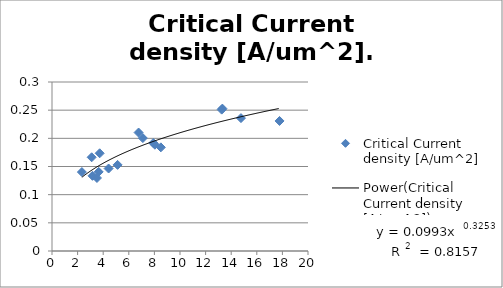
| Category | Critical Current density [A/um^2] |
|---|---|
| 3.1651999999999996 | 0.133 |
| 2.3352 | 0.14 |
| 3.6456 | 0.14 |
| 3.0997 | 0.166 |
| 3.5133 | 0.13 |
| 4.421500000000001 | 0.146 |
| 5.124 | 0.153 |
| 3.7249 | 0.173 |
| 8.0388 | 0.189 |
| 8.5039 | 0.184 |
| 7.097 | 0.2 |
| 6.7646 | 0.21 |
| 7.9112 | 0.192 |
| 14.761999999999999 | 0.236 |
| 17.776999999999997 | 0.231 |
| 13.2568 | 0.251 |
| 13.3108 | 0.253 |